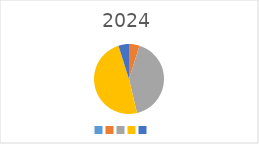
| Category | Series 0 |
|---|---|
|  | 0 |
|  | 20000 |
|  | 170000 |
|  | 200000 |
|  | 20000 |